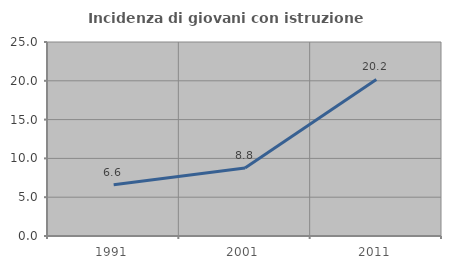
| Category | Incidenza di giovani con istruzione universitaria |
|---|---|
| 1991.0 | 6.591 |
| 2001.0 | 8.767 |
| 2011.0 | 20.18 |